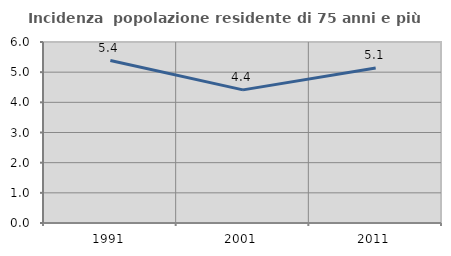
| Category | Incidenza  popolazione residente di 75 anni e più |
|---|---|
| 1991.0 | 5.386 |
| 2001.0 | 4.414 |
| 2011.0 | 5.136 |